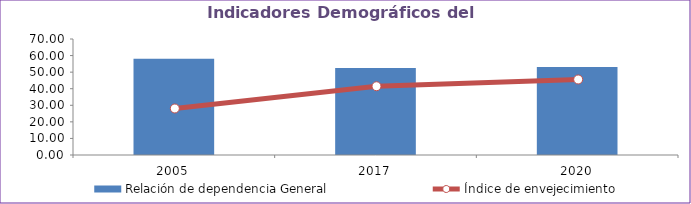
| Category | Relación de dependencia General |
|---|---|
| 2005.0 | 58.043 |
| 2017.0 | 52.559 |
| 2020.0 | 53.043 |